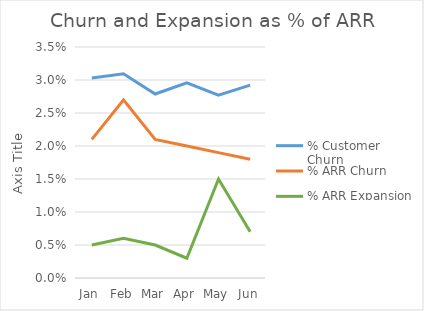
| Category | % Customer Churn | % ARR Churn | % ARR Expansion |
|---|---|---|---|
| Jan | 0.03 | 0.021 | 0.005 |
| Feb | 0.031 | 0.027 | 0.006 |
| Mar | 0.028 | 0.021 | 0.005 |
| Apr | 0.03 | 0.02 | 0.003 |
| May | 0.028 | 0.019 | 0.015 |
| Jun | 0.029 | 0.018 | 0.007 |